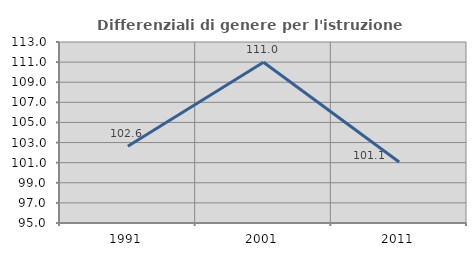
| Category | Differenziali di genere per l'istruzione superiore |
|---|---|
| 1991.0 | 102.632 |
| 2001.0 | 110.984 |
| 2011.0 | 101.062 |